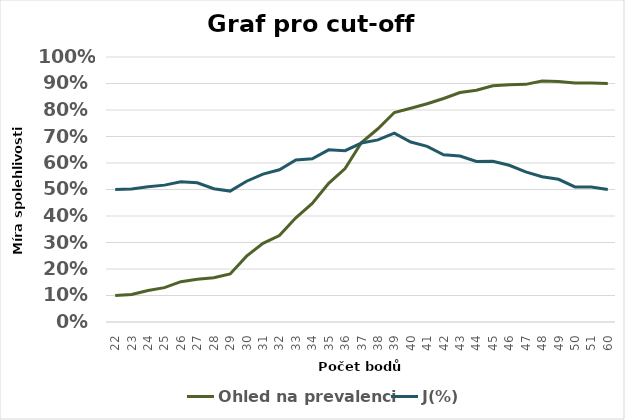
| Category | Ohled na prevalenci | J(%) |
|---|---|---|
| 22.0 | 0.1 | 0.5 |
| 23.0 | 0.104 | 0.502 |
| 24.0 | 0.119 | 0.51 |
| 25.0 | 0.13 | 0.517 |
| 26.0 | 0.152 | 0.529 |
| 27.0 | 0.161 | 0.526 |
| 28.0 | 0.167 | 0.503 |
| 29.0 | 0.181 | 0.494 |
| 30.0 | 0.248 | 0.531 |
| 31.0 | 0.297 | 0.558 |
| 32.0 | 0.326 | 0.575 |
| 33.0 | 0.393 | 0.612 |
| 34.0 | 0.447 | 0.616 |
| 35.0 | 0.523 | 0.65 |
| 36.0 | 0.579 | 0.646 |
| 37.0 | 0.677 | 0.675 |
| 38.0 | 0.729 | 0.687 |
| 39.0 | 0.79 | 0.713 |
| 40.0 | 0.807 | 0.679 |
| 41.0 | 0.823 | 0.663 |
| 42.0 | 0.844 | 0.631 |
| 43.0 | 0.866 | 0.626 |
| 44.0 | 0.875 | 0.606 |
| 45.0 | 0.892 | 0.606 |
| 46.0 | 0.895 | 0.591 |
| 47.0 | 0.897 | 0.567 |
| 48.0 | 0.91 | 0.548 |
| 49.0 | 0.908 | 0.538 |
| 50.0 | 0.902 | 0.51 |
| 51.0 | 0.902 | 0.51 |
| 60.0 | 0.9 | 0.5 |